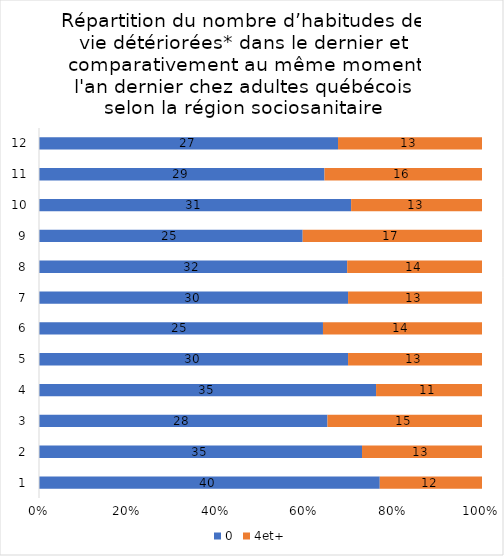
| Category | 0 | 4et+ |
|---|---|---|
| 0 | 40 | 12 |
| 1 | 35 | 13 |
| 2 | 28 | 15 |
| 3 | 35 | 11 |
| 4 | 30 | 13 |
| 5 | 25 | 14 |
| 6 | 30 | 13 |
| 7 | 32 | 14 |
| 8 | 25 | 17 |
| 9 | 31 | 13 |
| 10 | 29 | 16 |
| 11 | 27 | 13 |